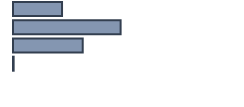
| Category | Series 0 |
|---|---|
| 0 | 21.598 |
| 1 | 47.404 |
| 2 | 30.714 |
| 3 | 0.284 |
| 4 | 0 |